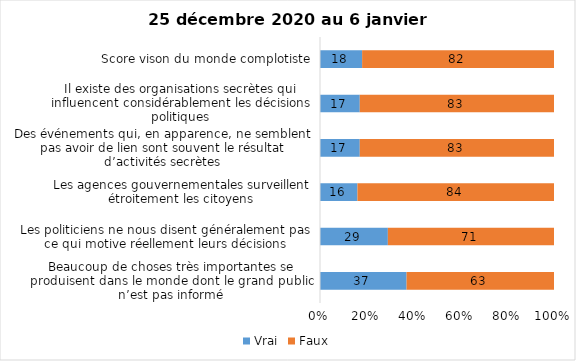
| Category | Vrai | Faux |
|---|---|---|
| Beaucoup de choses très importantes se produisent dans le monde dont le grand public n’est pas informé | 37 | 63 |
| Les politiciens ne nous disent généralement pas ce qui motive réellement leurs décisions | 29 | 71 |
| Les agences gouvernementales surveillent étroitement les citoyens | 16 | 84 |
| Des événements qui, en apparence, ne semblent pas avoir de lien sont souvent le résultat d’activités secrètes | 17 | 83 |
| Il existe des organisations secrètes qui influencent considérablement les décisions politiques | 17 | 83 |
| Score vison du monde complotiste | 18 | 82 |